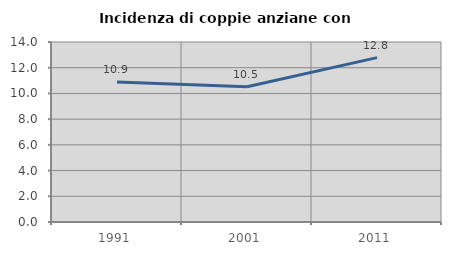
| Category | Incidenza di coppie anziane con figli |
|---|---|
| 1991.0 | 10.897 |
| 2001.0 | 10.526 |
| 2011.0 | 12.782 |